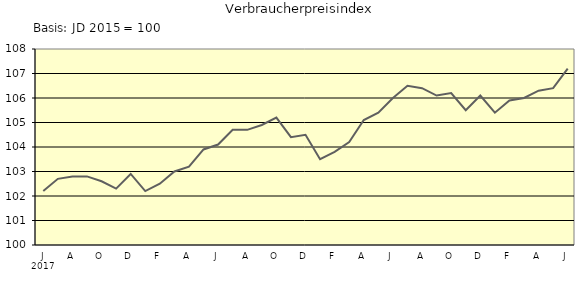
| Category | Series 0 |
|---|---|
| 0 | 102.2 |
| 1 | 102.7 |
| 2 | 102.8 |
| 3 | 102.8 |
| 4 | 102.6 |
| 5 | 102.3 |
| 6 | 102.9 |
| 7 | 102.2 |
| 8 | 102.5 |
| 9 | 103 |
| 10 | 103.2 |
| 11 | 103.9 |
| 12 | 104.1 |
| 13 | 104.7 |
| 14 | 104.7 |
| 15 | 104.9 |
| 16 | 105.2 |
| 17 | 104.4 |
| 18 | 104.5 |
| 19 | 103.5 |
| 20 | 103.8 |
| 21 | 104.2 |
| 22 | 105.1 |
| 23 | 105.4 |
| 24 | 106 |
| 25 | 106.5 |
| 26 | 106.4 |
| 27 | 106.1 |
| 28 | 106.2 |
| 29 | 105.5 |
| 30 | 106.1 |
| 31 | 105.4 |
| 32 | 105.9 |
| 33 | 106 |
| 34 | 106.3 |
| 35 | 106.4 |
| 36 | 107.2 |